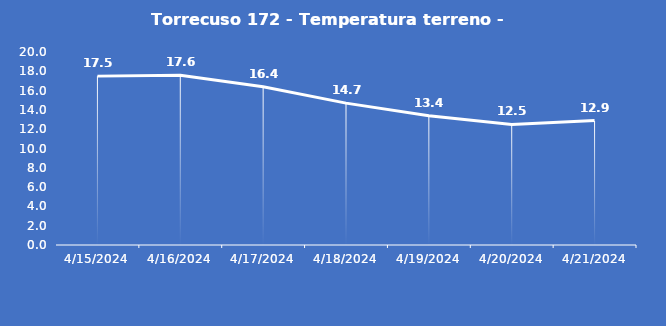
| Category | Torrecuso 172 - Temperatura terreno - Grezzo (°C) |
|---|---|
| 4/15/24 | 17.5 |
| 4/16/24 | 17.6 |
| 4/17/24 | 16.4 |
| 4/18/24 | 14.7 |
| 4/19/24 | 13.4 |
| 4/20/24 | 12.5 |
| 4/21/24 | 12.9 |